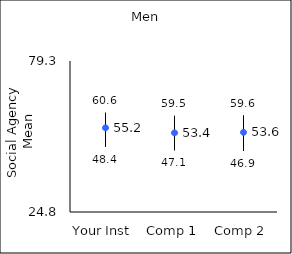
| Category | 25th percentile | 75th percentile | Mean |
|---|---|---|---|
| Your Inst | 48.4 | 60.6 | 55.18 |
| Comp 1 | 47.1 | 59.5 | 53.36 |
| Comp 2 | 46.9 | 59.6 | 53.55 |